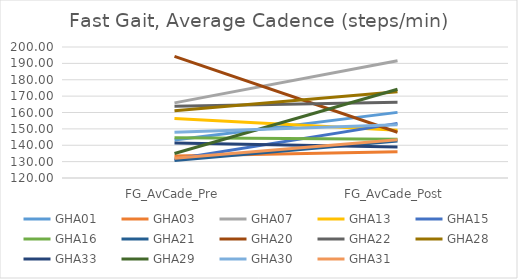
| Category | GHA01 | GHA03 | GHA07 | GHA13 | GHA15 | GHA16 | GHA21 | GHA20 | GHA22 | GHA28 | GHA33 | GHA29 | GHA30 | GHA31 |
|---|---|---|---|---|---|---|---|---|---|---|---|---|---|---|
| FG_AvCade_Pre | 143.231 | 133.496 | 165.889 | 156.304 | 131.466 | 144.653 | 130.659 | 194.25 | 163.783 | 161.084 | 141.389 | 134.926 | 147.909 | 132.086 |
| FG_AvCade_Post | 160.08 | 136.037 | 191.603 | 149.133 | 153.35 | 143.686 | 142.612 | 147.958 | 166.287 | 172.652 | 138.981 | 174.227 | 152.496 | 143.296 |